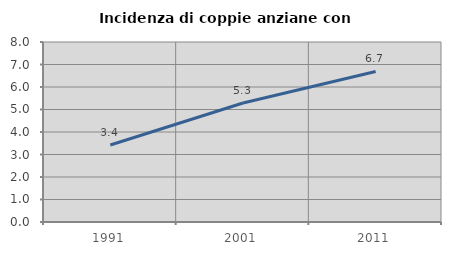
| Category | Incidenza di coppie anziane con figli |
|---|---|
| 1991.0 | 3.424 |
| 2001.0 | 5.291 |
| 2011.0 | 6.69 |